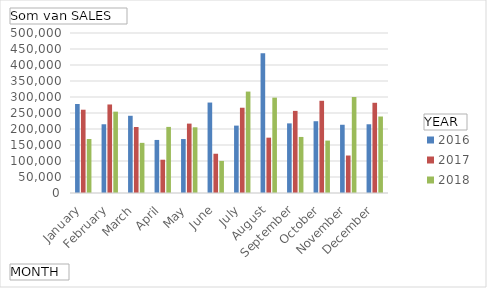
| Category | 2016 | 2017 | 2018 |
|---|---|---|---|
| January | 278219 | 260257 | 168768 |
| February | 214797 | 276650 | 254213 |
| March | 241305 | 206238 | 156727 |
| April | 165809 | 103986 | 206572 |
| May | 168586 | 216860 | 205352 |
| June | 282650 | 122689 | 100282 |
| July | 210603 | 266442 | 316963 |
| August | 436787 | 172938 | 298028 |
| September | 217554 | 256598 | 175184 |
| October | 224281 | 288170 | 163813 |
| November | 213269 | 117132 | 299939 |
| December | 214768 | 281932 | 239024 |